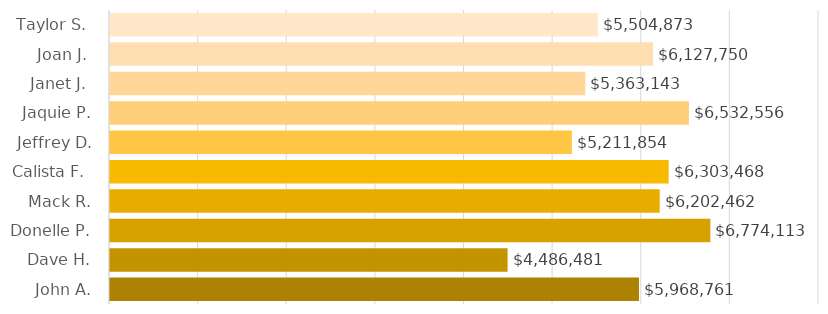
| Category | Series 0 |
|---|---|
| John A. | 5968761 |
| Dave H. | 4486481 |
| Donelle P. | 6774113 |
| Mack R. | 6202462 |
| Calista F.  | 6303468 |
| Jeffrey D. | 5211854 |
| Jaquie P. | 6532556 |
| Janet J.  | 5363143 |
| Joan J.  | 6127750 |
| Taylor S.  | 5504873 |